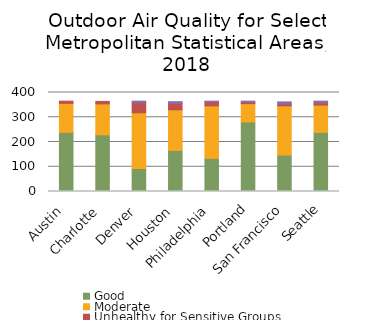
| Category | Good | Moderate | Unhealthy for Sensitive Groups | Unhealthy   |
|---|---|---|---|---|
| Austin | 239 | 117 | 9 | 0 |
| Charlotte | 229 | 125 | 10 | 0 |
| Denver | 93 | 225 | 41 | 6 |
| Houston | 166 | 164 | 26 | 7 |
| Philadelphia | 134 | 212 | 16 | 3 |
| Portland | 281 | 74 | 6 | 4 |
| San Francisco | 147 | 199 | 7 | 9 |
| Seattle | 239 | 110 | 9 | 7 |